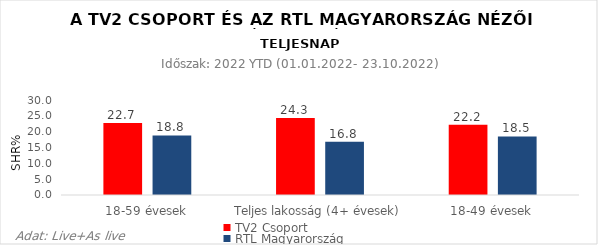
| Category | TV2 Csoport | RTL Magyarország |
|---|---|---|
| 18-59 évesek | 22.7 | 18.8 |
| Teljes lakosság (4+ évesek) | 24.3 | 16.8 |
| 18-49 évesek | 22.2 | 18.5 |